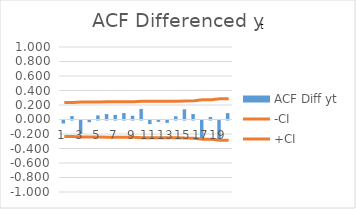
| Category | ACF Diff yt |
|---|---|
| 0 | -0.041 |
| 1 | 0.047 |
| 2 | -0.182 |
| 3 | -0.023 |
| 4 | 0.057 |
| 5 | 0.075 |
| 6 | 0.064 |
| 7 | 0.089 |
| 8 | 0.052 |
| 9 | 0.145 |
| 10 | -0.05 |
| 11 | -0.019 |
| 12 | -0.032 |
| 13 | 0.045 |
| 14 | 0.14 |
| 15 | 0.076 |
| 16 | -0.262 |
| 17 | 0.035 |
| 18 | -0.257 |
| 19 | 0.088 |